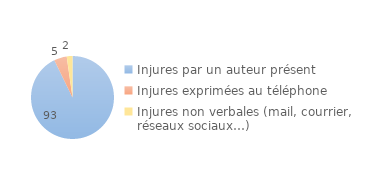
| Category | Series 0 |
|---|---|
| Injures par un auteur présent | 93.204 |
| Injures exprimées au téléphone | 5 |
| Injures non verbales (mail, courrier, réseaux sociaux…) | 2.239 |